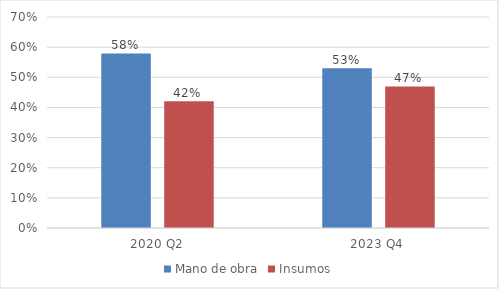
| Category | Mano de obra | Insumos |
|---|---|---|
| 2020 Q2 | 0.579 | 0.421 |
| 2023 Q4 | 0.53 | 0.47 |